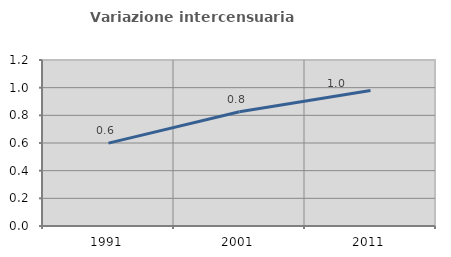
| Category | Variazione intercensuaria annua |
|---|---|
| 1991.0 | 0.599 |
| 2001.0 | 0.826 |
| 2011.0 | 0.979 |